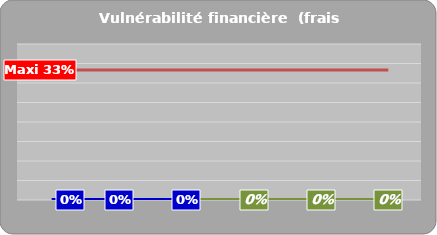
| Category | Series 0 | Maxi |
|---|---|---|
|   | 0 | 0.333 |
|   | 0 | 0.333 |
|   | 0 | 0.333 |
|   | 0 | 0.333 |
|   | 0 | 0.333 |
|   | 0 | 0.333 |